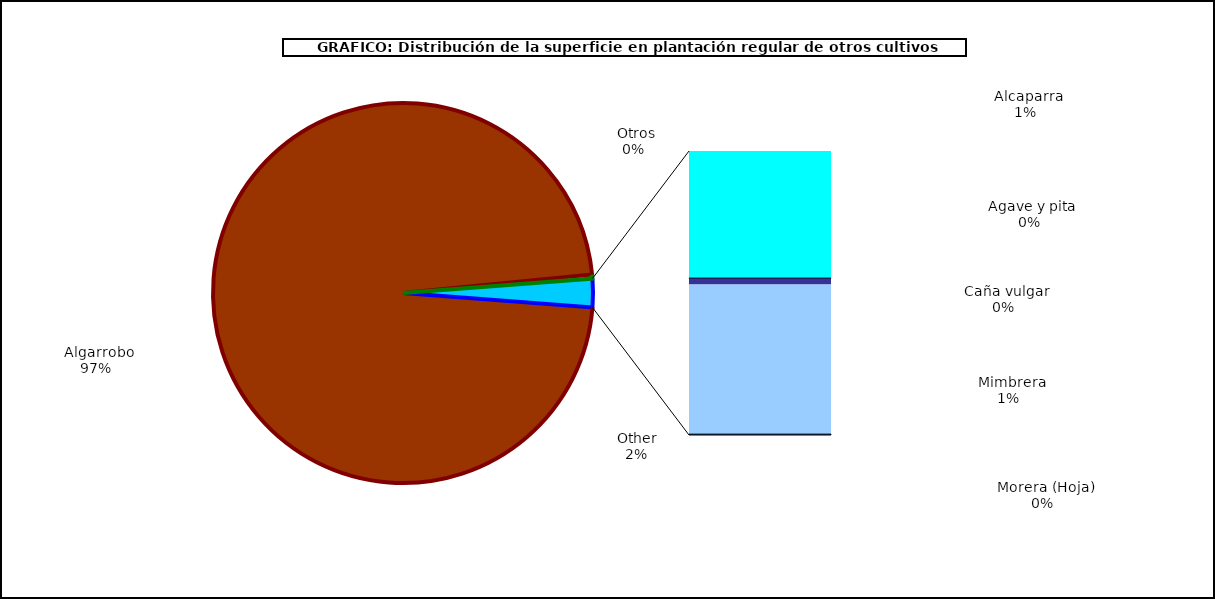
| Category | Series 0 |
|---|---|
|   Algarrobo | 40353 |
|   Otros | 141 |
|   Alcaparra | 450 |
|   Agave y pita | 1 |
|   Caña vulgar | 21 |
|   Mimbrera | 530 |
|   Morera (Hoja) | 3 |